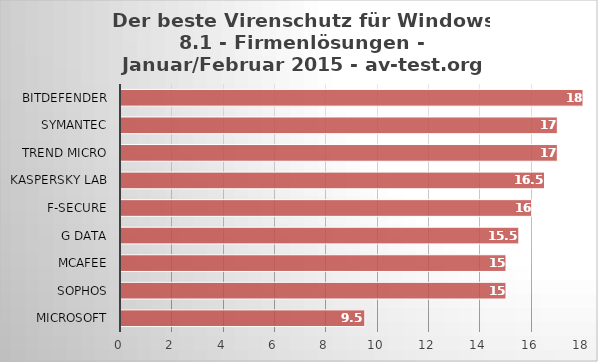
| Category | Series 0 |
|---|---|
| Microsoft | 9.5 |
| Sophos | 15 |
| McAfee | 15 |
| G Data | 15.5 |
| F-Secure | 16 |
| Kaspersky Lab | 16.5 |
| Trend Micro | 17 |
| Symantec | 17 |
| Bitdefender | 18 |